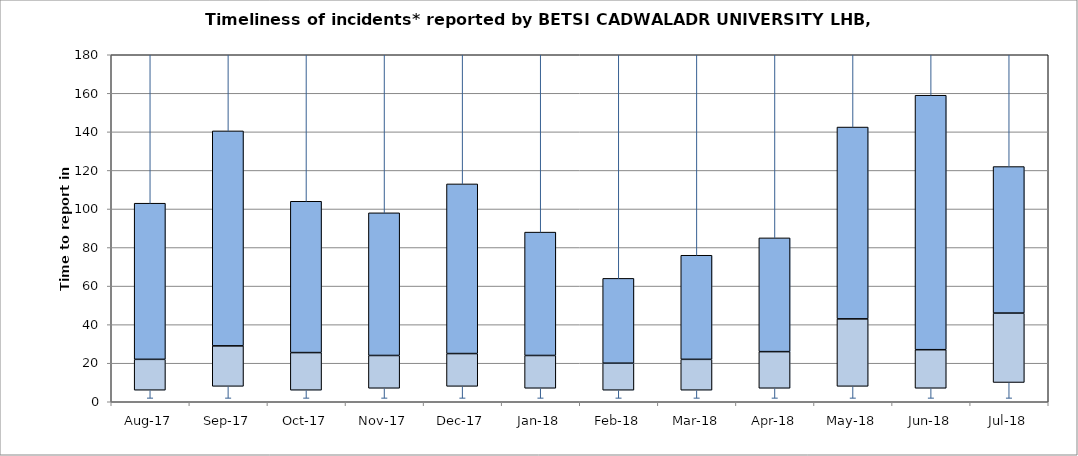
| Category | Series 0 | Series 1 | Series 2 |
|---|---|---|---|
| Aug-17 | 6 | 16 | 81 |
| Sep-17 | 8 | 21 | 111.5 |
| Oct-17 | 6 | 19.5 | 78.5 |
| Nov-17 | 7 | 17 | 74 |
| Dec-17 | 8 | 17 | 88 |
| Jan-18 | 7 | 17 | 64 |
| Feb-18 | 6 | 14 | 44 |
| Mar-18 | 6 | 16 | 54 |
| Apr-18 | 7 | 19 | 59 |
| May-18 | 8 | 35 | 99.5 |
| Jun-18 | 7 | 20 | 132 |
| Jul-18 | 10 | 36 | 76 |